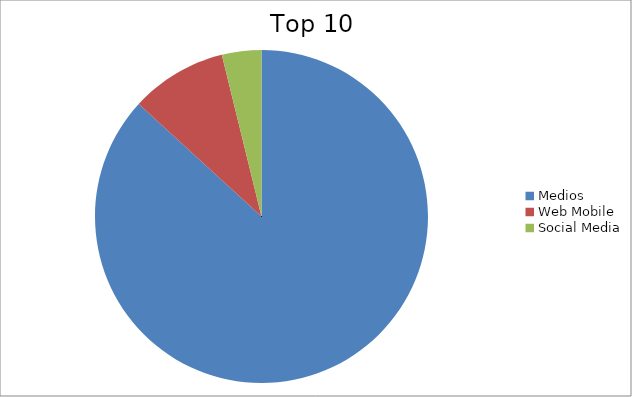
| Category | Series 0 |
|---|---|
| Medios | 86.81 |
| Web Mobile | 9.37 |
| Social Media | 3.83 |